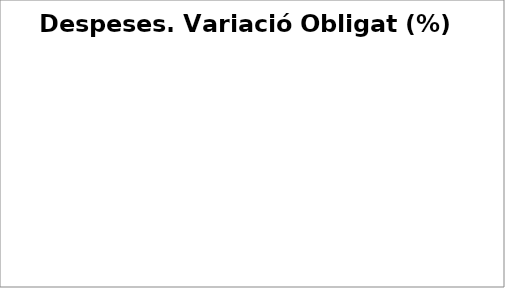
| Category | Series 0 |
|---|---|
| Despeses de personal | 0.003 |
| Despeses en béns corrents i serveis | 0.033 |
| Despeses financeres | -0.252 |
| Transferències corrents | 0.067 |
| Fons de contingència | 0 |
| Inversions reals | 0.423 |
| Transferències de capital | 0.277 |
| Actius financers | 0.661 |
| Passius financers | 0.223 |